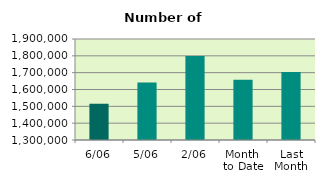
| Category | Series 0 |
|---|---|
| 6/06 | 1515380 |
| 5/06 | 1640900 |
| 2/06 | 1799440 |
| Month 
to Date | 1658033.5 |
| Last
Month | 1704183.636 |